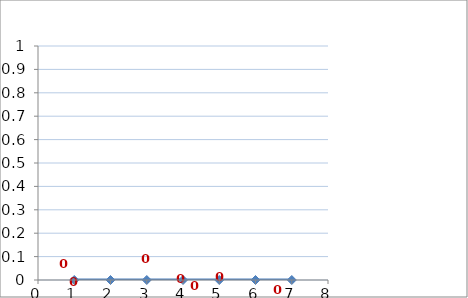
| Category | Series 0 |
|---|---|
| 1.0 | 9.93 |
| 2.0 | 2.79 |
| 3.0 | -0.73 |
| 4.0 | -3.32 |
| 5.0 | 7.89 |
| 6.0 | 12.8 |
| 7.0 | 9.61 |